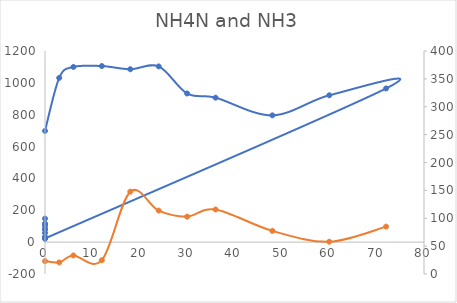
| Category | Series 0 |
|---|---|
| 0.0 | 698.384 |
| 3.0 | 1031.058 |
| 6.0 | 1099.894 |
| 12.0 | 1105.552 |
| 18.0 | 1085.501 |
| 24.0 | 1103.242 |
| 30.0 | 933.283 |
| 36.0 | 907.052 |
| 48.0 | 795.937 |
| 60.0 | 921.954 |
| 72.0 | 964.967 |